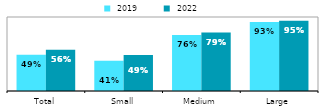
| Category |  2019 |  2022 |
|---|---|---|
| Total | 0.491 | 0.556 |
| Small | 0.409 | 0.486 |
| Medium | 0.756 | 0.789 |
| Large | 0.932 | 0.95 |